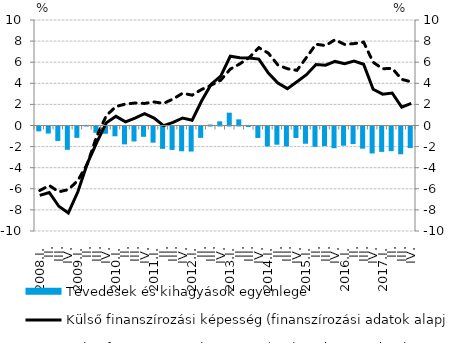
| Category | Tévedések és kihagyások egyenlege |
|---|---|
| 2008.I. | -0.462 |
| II. | -0.666 |
| III. | -1.371 |
| IV. | -2.208 |
| 2009.I. | -1.075 |
| II. | 0.056 |
| III. | -0.595 |
| IV. | -0.688 |
| 2010.I. | -0.929 |
| II. | -1.692 |
| III. | -1.42 |
| IV. | -0.975 |
| 2011.I. | -1.533 |
| II. | -2.118 |
| III. | -2.221 |
| IV. | -2.347 |
| 2012.I. | -2.376 |
| II. | -1.077 |
| III. | 0.091 |
| IV. | 0.393 |
| 2013.I. | 1.215 |
| II. | 0.583 |
| III. | -0.044 |
| IV. | -1.086 |
| 2014.I. | -1.893 |
| II. | -1.724 |
| III. | -1.889 |
| IV. | -1.087 |
| 2015.I. | -1.635 |
| II. | -1.926 |
| III. | -1.86 |
| IV. | -2.057 |
| 2016.I. | -1.82 |
| II. | -1.664 |
| III. | -2.098 |
| IV. | -2.557 |
| 2017.I. | -2.405 |
| II. | -2.339 |
| III. | -2.635 |
| IV. | -2.047 |